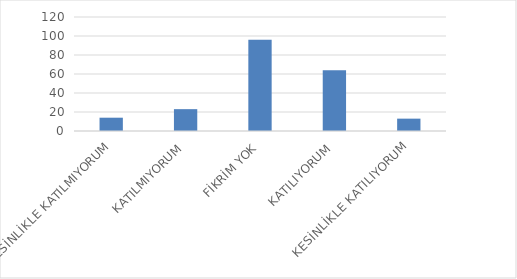
| Category | Series 0 |
|---|---|
| KESİNLİKLE KATILMIYORUM | 14 |
| KATILMIYORUM | 23 |
| FİKRİM YOK | 96 |
| KATILIYORUM | 64 |
| KESİNLİKLE KATILIYORUM | 13 |